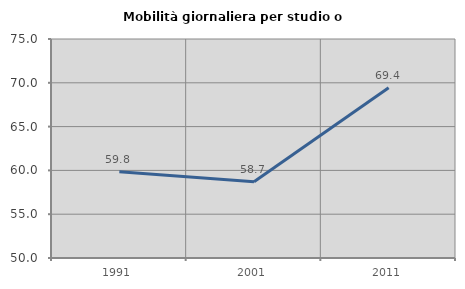
| Category | Mobilità giornaliera per studio o lavoro |
|---|---|
| 1991.0 | 59.845 |
| 2001.0 | 58.714 |
| 2011.0 | 69.447 |